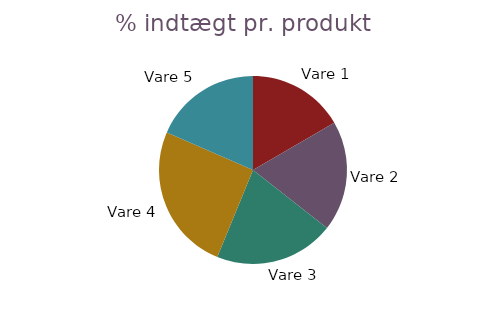
| Category | I alt 
Indtægt2 |
|---|---|
| Vare 1 | 196.75 |
| Vare 2 | 224.625 |
| Vare 3 | 244 |
| Vare 4 | 300 |
| Vare 5 | 218.4 |